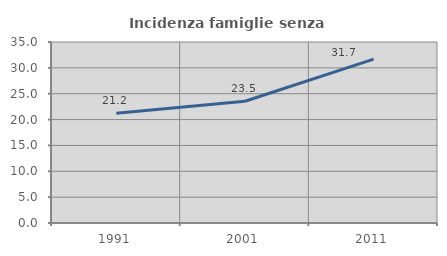
| Category | Incidenza famiglie senza nuclei |
|---|---|
| 1991.0 | 21.203 |
| 2001.0 | 23.55 |
| 2011.0 | 31.675 |